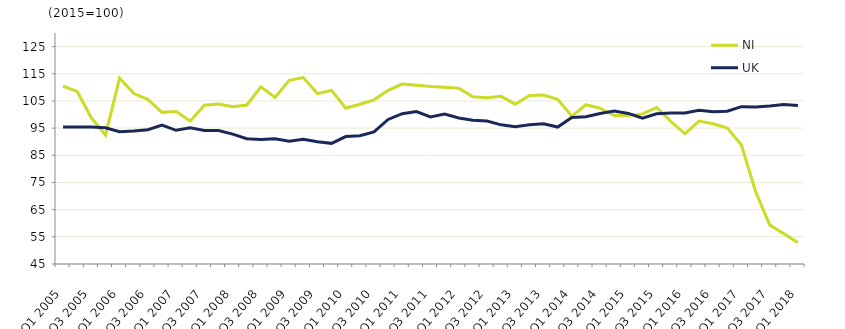
| Category | NI  | UK  |
|---|---|---|
| Q1 2005 | 110.4 | 95.4 |
|  | 108.5 | 95.4 |
| Q3 2005 | 98.8 | 95.4 |
|  | 92.4 | 95.1 |
| Q1 2006 | 113.4 | 93.7 |
|  | 107.7 | 93.9 |
| Q3 2006 | 105.6 | 94.4 |
|  | 100.8 | 96.1 |
| Q1 2007 | 101.1 | 94.2 |
|  | 97.6 | 95.1 |
| Q3 2007 | 103.4 | 94.1 |
|  | 103.9 | 94.1 |
| Q1 2008 | 102.9 | 92.8 |
|  | 103.5 | 91.1 |
| Q3 2008 | 110.2 | 90.8 |
|  | 106.3 | 91.1 |
| Q1 2009 | 112.6 | 90.2 |
|  | 113.6 | 90.9 |
| Q3 2009 | 107.7 | 90 |
|  | 108.9 | 89.4 |
| Q1 2010 | 102.3 | 91.9 |
|  | 103.8 | 92.2 |
| Q3 2010 | 105.4 | 93.6 |
|  | 108.9 | 98.2 |
| Q1 2011 | 111.2 | 100.3 |
|  | 110.8 | 101.1 |
| Q3 2011 | 110.3 | 99.1 |
|  | 110 | 100.2 |
| Q1 2012 | 109.7 | 98.7 |
|  | 106.5 | 97.9 |
| Q3 2012 | 106.2 | 97.6 |
|  | 106.7 | 96.2 |
| Q1 2013 | 103.8 | 95.5 |
|  | 107 | 96.2 |
| Q3 2013 | 107.2 | 96.6 |
|  | 105.6 | 95.4 |
| Q1 2014 | 99.4 | 98.9 |
|  | 103.6 | 99.2 |
| Q3 2014 | 102.3 | 100.4 |
|  | 99.6 | 101.3 |
| Q1 2015 | 99.6 | 100.4 |
|  | 100.2 | 98.7 |
| Q3 2015 | 102.6 | 100.3 |
|  | 97.5 | 100.6 |
| Q1 2016 | 92.9 | 100.6 |
|  | 97.6 | 101.6 |
| Q3 2016 | 96.6 | 101 |
|  | 95 | 101.2 |
| Q1 2017 | 88.8 | 102.9 |
|  | 71.7 | 102.8 |
| Q3 2017 | 59.4 | 103.1 |
|  | 56.1 | 103.7 |
| Q1 2018 | 52.9 | 103.3 |